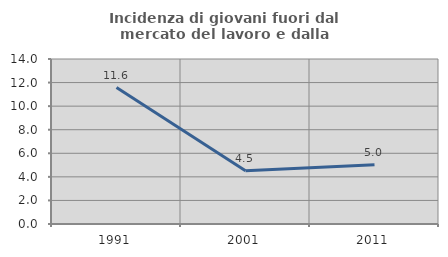
| Category | Incidenza di giovani fuori dal mercato del lavoro e dalla formazione  |
|---|---|
| 1991.0 | 11.579 |
| 2001.0 | 4.525 |
| 2011.0 | 5.018 |